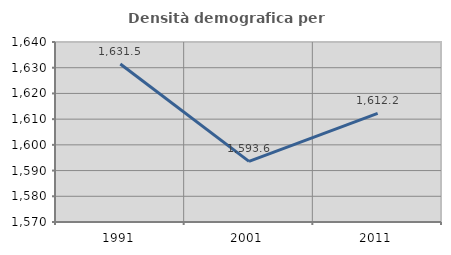
| Category | Densità demografica |
|---|---|
| 1991.0 | 1631.457 |
| 2001.0 | 1593.593 |
| 2011.0 | 1612.225 |